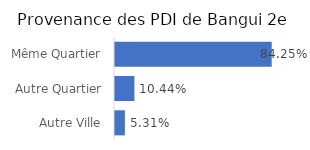
| Category | Provenance des PDI |
|---|---|
| Autre Ville | 0.053 |
| Autre Quartier | 0.104 |
| Même Quartier | 0.842 |